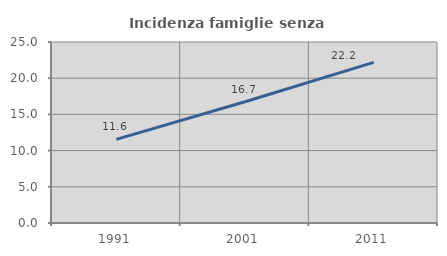
| Category | Incidenza famiglie senza nuclei |
|---|---|
| 1991.0 | 11.553 |
| 2001.0 | 16.748 |
| 2011.0 | 22.181 |